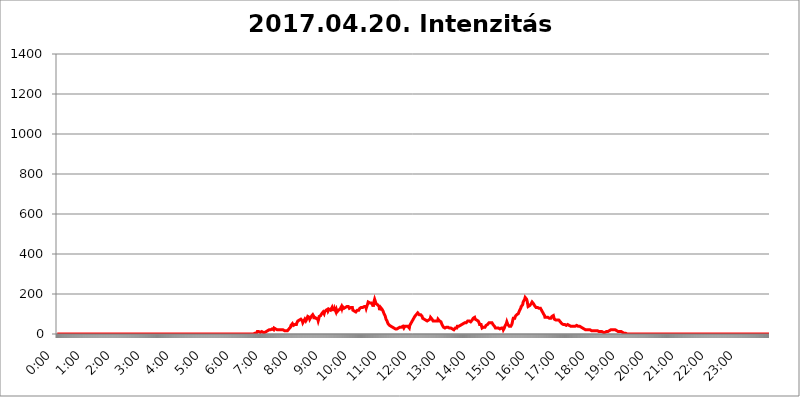
| Category | 2017.04.20. Intenzitás [W/m^2] |
|---|---|
| 0.0 | 0 |
| 0.0006944444444444445 | 0 |
| 0.001388888888888889 | 0 |
| 0.0020833333333333333 | 0 |
| 0.002777777777777778 | 0 |
| 0.003472222222222222 | 0 |
| 0.004166666666666667 | 0 |
| 0.004861111111111111 | 0 |
| 0.005555555555555556 | 0 |
| 0.0062499999999999995 | 0 |
| 0.006944444444444444 | 0 |
| 0.007638888888888889 | 0 |
| 0.008333333333333333 | 0 |
| 0.009027777777777779 | 0 |
| 0.009722222222222222 | 0 |
| 0.010416666666666666 | 0 |
| 0.011111111111111112 | 0 |
| 0.011805555555555555 | 0 |
| 0.012499999999999999 | 0 |
| 0.013194444444444444 | 0 |
| 0.013888888888888888 | 0 |
| 0.014583333333333332 | 0 |
| 0.015277777777777777 | 0 |
| 0.015972222222222224 | 0 |
| 0.016666666666666666 | 0 |
| 0.017361111111111112 | 0 |
| 0.018055555555555557 | 0 |
| 0.01875 | 0 |
| 0.019444444444444445 | 0 |
| 0.02013888888888889 | 0 |
| 0.020833333333333332 | 0 |
| 0.02152777777777778 | 0 |
| 0.022222222222222223 | 0 |
| 0.02291666666666667 | 0 |
| 0.02361111111111111 | 0 |
| 0.024305555555555556 | 0 |
| 0.024999999999999998 | 0 |
| 0.025694444444444447 | 0 |
| 0.02638888888888889 | 0 |
| 0.027083333333333334 | 0 |
| 0.027777777777777776 | 0 |
| 0.02847222222222222 | 0 |
| 0.029166666666666664 | 0 |
| 0.029861111111111113 | 0 |
| 0.030555555555555555 | 0 |
| 0.03125 | 0 |
| 0.03194444444444445 | 0 |
| 0.03263888888888889 | 0 |
| 0.03333333333333333 | 0 |
| 0.034027777777777775 | 0 |
| 0.034722222222222224 | 0 |
| 0.035416666666666666 | 0 |
| 0.036111111111111115 | 0 |
| 0.03680555555555556 | 0 |
| 0.0375 | 0 |
| 0.03819444444444444 | 0 |
| 0.03888888888888889 | 0 |
| 0.03958333333333333 | 0 |
| 0.04027777777777778 | 0 |
| 0.04097222222222222 | 0 |
| 0.041666666666666664 | 0 |
| 0.042361111111111106 | 0 |
| 0.04305555555555556 | 0 |
| 0.043750000000000004 | 0 |
| 0.044444444444444446 | 0 |
| 0.04513888888888889 | 0 |
| 0.04583333333333334 | 0 |
| 0.04652777777777778 | 0 |
| 0.04722222222222222 | 0 |
| 0.04791666666666666 | 0 |
| 0.04861111111111111 | 0 |
| 0.049305555555555554 | 0 |
| 0.049999999999999996 | 0 |
| 0.05069444444444445 | 0 |
| 0.051388888888888894 | 0 |
| 0.052083333333333336 | 0 |
| 0.05277777777777778 | 0 |
| 0.05347222222222222 | 0 |
| 0.05416666666666667 | 0 |
| 0.05486111111111111 | 0 |
| 0.05555555555555555 | 0 |
| 0.05625 | 0 |
| 0.05694444444444444 | 0 |
| 0.057638888888888885 | 0 |
| 0.05833333333333333 | 0 |
| 0.05902777777777778 | 0 |
| 0.059722222222222225 | 0 |
| 0.06041666666666667 | 0 |
| 0.061111111111111116 | 0 |
| 0.06180555555555556 | 0 |
| 0.0625 | 0 |
| 0.06319444444444444 | 0 |
| 0.06388888888888888 | 0 |
| 0.06458333333333334 | 0 |
| 0.06527777777777778 | 0 |
| 0.06597222222222222 | 0 |
| 0.06666666666666667 | 0 |
| 0.06736111111111111 | 0 |
| 0.06805555555555555 | 0 |
| 0.06874999999999999 | 0 |
| 0.06944444444444443 | 0 |
| 0.07013888888888889 | 0 |
| 0.07083333333333333 | 0 |
| 0.07152777777777779 | 0 |
| 0.07222222222222223 | 0 |
| 0.07291666666666667 | 0 |
| 0.07361111111111111 | 0 |
| 0.07430555555555556 | 0 |
| 0.075 | 0 |
| 0.07569444444444444 | 0 |
| 0.0763888888888889 | 0 |
| 0.07708333333333334 | 0 |
| 0.07777777777777778 | 0 |
| 0.07847222222222222 | 0 |
| 0.07916666666666666 | 0 |
| 0.0798611111111111 | 0 |
| 0.08055555555555556 | 0 |
| 0.08125 | 0 |
| 0.08194444444444444 | 0 |
| 0.08263888888888889 | 0 |
| 0.08333333333333333 | 0 |
| 0.08402777777777777 | 0 |
| 0.08472222222222221 | 0 |
| 0.08541666666666665 | 0 |
| 0.08611111111111112 | 0 |
| 0.08680555555555557 | 0 |
| 0.08750000000000001 | 0 |
| 0.08819444444444445 | 0 |
| 0.08888888888888889 | 0 |
| 0.08958333333333333 | 0 |
| 0.09027777777777778 | 0 |
| 0.09097222222222222 | 0 |
| 0.09166666666666667 | 0 |
| 0.09236111111111112 | 0 |
| 0.09305555555555556 | 0 |
| 0.09375 | 0 |
| 0.09444444444444444 | 0 |
| 0.09513888888888888 | 0 |
| 0.09583333333333333 | 0 |
| 0.09652777777777777 | 0 |
| 0.09722222222222222 | 0 |
| 0.09791666666666667 | 0 |
| 0.09861111111111111 | 0 |
| 0.09930555555555555 | 0 |
| 0.09999999999999999 | 0 |
| 0.10069444444444443 | 0 |
| 0.1013888888888889 | 0 |
| 0.10208333333333335 | 0 |
| 0.10277777777777779 | 0 |
| 0.10347222222222223 | 0 |
| 0.10416666666666667 | 0 |
| 0.10486111111111111 | 0 |
| 0.10555555555555556 | 0 |
| 0.10625 | 0 |
| 0.10694444444444444 | 0 |
| 0.1076388888888889 | 0 |
| 0.10833333333333334 | 0 |
| 0.10902777777777778 | 0 |
| 0.10972222222222222 | 0 |
| 0.1111111111111111 | 0 |
| 0.11180555555555556 | 0 |
| 0.11180555555555556 | 0 |
| 0.1125 | 0 |
| 0.11319444444444444 | 0 |
| 0.11388888888888889 | 0 |
| 0.11458333333333333 | 0 |
| 0.11527777777777777 | 0 |
| 0.11597222222222221 | 0 |
| 0.11666666666666665 | 0 |
| 0.1173611111111111 | 0 |
| 0.11805555555555557 | 0 |
| 0.11944444444444445 | 0 |
| 0.12013888888888889 | 0 |
| 0.12083333333333333 | 0 |
| 0.12152777777777778 | 0 |
| 0.12222222222222223 | 0 |
| 0.12291666666666667 | 0 |
| 0.12291666666666667 | 0 |
| 0.12361111111111112 | 0 |
| 0.12430555555555556 | 0 |
| 0.125 | 0 |
| 0.12569444444444444 | 0 |
| 0.12638888888888888 | 0 |
| 0.12708333333333333 | 0 |
| 0.16875 | 0 |
| 0.12847222222222224 | 0 |
| 0.12916666666666668 | 0 |
| 0.12986111111111112 | 0 |
| 0.13055555555555556 | 0 |
| 0.13125 | 0 |
| 0.13194444444444445 | 0 |
| 0.1326388888888889 | 0 |
| 0.13333333333333333 | 0 |
| 0.13402777777777777 | 0 |
| 0.13402777777777777 | 0 |
| 0.13472222222222222 | 0 |
| 0.13541666666666666 | 0 |
| 0.1361111111111111 | 0 |
| 0.13749999999999998 | 0 |
| 0.13819444444444443 | 0 |
| 0.1388888888888889 | 0 |
| 0.13958333333333334 | 0 |
| 0.14027777777777778 | 0 |
| 0.14097222222222222 | 0 |
| 0.14166666666666666 | 0 |
| 0.1423611111111111 | 0 |
| 0.14305555555555557 | 0 |
| 0.14375000000000002 | 0 |
| 0.14444444444444446 | 0 |
| 0.1451388888888889 | 0 |
| 0.1451388888888889 | 0 |
| 0.14652777777777778 | 0 |
| 0.14722222222222223 | 0 |
| 0.14791666666666667 | 0 |
| 0.1486111111111111 | 0 |
| 0.14930555555555555 | 0 |
| 0.15 | 0 |
| 0.15069444444444444 | 0 |
| 0.15138888888888888 | 0 |
| 0.15208333333333332 | 0 |
| 0.15277777777777776 | 0 |
| 0.15347222222222223 | 0 |
| 0.15416666666666667 | 0 |
| 0.15486111111111112 | 0 |
| 0.15555555555555556 | 0 |
| 0.15625 | 0 |
| 0.15694444444444444 | 0 |
| 0.15763888888888888 | 0 |
| 0.15833333333333333 | 0 |
| 0.15902777777777777 | 0 |
| 0.15972222222222224 | 0 |
| 0.16041666666666668 | 0 |
| 0.16111111111111112 | 0 |
| 0.16180555555555556 | 0 |
| 0.1625 | 0 |
| 0.16319444444444445 | 0 |
| 0.1638888888888889 | 0 |
| 0.16458333333333333 | 0 |
| 0.16527777777777777 | 0 |
| 0.16597222222222222 | 0 |
| 0.16666666666666666 | 0 |
| 0.1673611111111111 | 0 |
| 0.16805555555555554 | 0 |
| 0.16874999999999998 | 0 |
| 0.16944444444444443 | 0 |
| 0.17013888888888887 | 0 |
| 0.1708333333333333 | 0 |
| 0.17152777777777775 | 0 |
| 0.17222222222222225 | 0 |
| 0.1729166666666667 | 0 |
| 0.17361111111111113 | 0 |
| 0.17430555555555557 | 0 |
| 0.17500000000000002 | 0 |
| 0.17569444444444446 | 0 |
| 0.1763888888888889 | 0 |
| 0.17708333333333334 | 0 |
| 0.17777777777777778 | 0 |
| 0.17847222222222223 | 0 |
| 0.17916666666666667 | 0 |
| 0.1798611111111111 | 0 |
| 0.18055555555555555 | 0 |
| 0.18125 | 0 |
| 0.18194444444444444 | 0 |
| 0.1826388888888889 | 0 |
| 0.18333333333333335 | 0 |
| 0.1840277777777778 | 0 |
| 0.18472222222222223 | 0 |
| 0.18541666666666667 | 0 |
| 0.18611111111111112 | 0 |
| 0.18680555555555556 | 0 |
| 0.1875 | 0 |
| 0.18819444444444444 | 0 |
| 0.18888888888888888 | 0 |
| 0.18958333333333333 | 0 |
| 0.19027777777777777 | 0 |
| 0.1909722222222222 | 0 |
| 0.19166666666666665 | 0 |
| 0.19236111111111112 | 0 |
| 0.19305555555555554 | 0 |
| 0.19375 | 0 |
| 0.19444444444444445 | 0 |
| 0.1951388888888889 | 0 |
| 0.19583333333333333 | 0 |
| 0.19652777777777777 | 0 |
| 0.19722222222222222 | 0 |
| 0.19791666666666666 | 0 |
| 0.1986111111111111 | 0 |
| 0.19930555555555554 | 0 |
| 0.19999999999999998 | 0 |
| 0.20069444444444443 | 0 |
| 0.20138888888888887 | 0 |
| 0.2020833333333333 | 0 |
| 0.2027777777777778 | 0 |
| 0.2034722222222222 | 0 |
| 0.2041666666666667 | 0 |
| 0.20486111111111113 | 0 |
| 0.20555555555555557 | 0 |
| 0.20625000000000002 | 0 |
| 0.20694444444444446 | 0 |
| 0.2076388888888889 | 0 |
| 0.20833333333333334 | 0 |
| 0.20902777777777778 | 0 |
| 0.20972222222222223 | 0 |
| 0.21041666666666667 | 0 |
| 0.2111111111111111 | 0 |
| 0.21180555555555555 | 0 |
| 0.2125 | 0 |
| 0.21319444444444444 | 0 |
| 0.2138888888888889 | 0 |
| 0.21458333333333335 | 0 |
| 0.2152777777777778 | 0 |
| 0.21597222222222223 | 0 |
| 0.21666666666666667 | 0 |
| 0.21736111111111112 | 0 |
| 0.21805555555555556 | 0 |
| 0.21875 | 0 |
| 0.21944444444444444 | 0 |
| 0.22013888888888888 | 0 |
| 0.22083333333333333 | 0 |
| 0.22152777777777777 | 0 |
| 0.2222222222222222 | 0 |
| 0.22291666666666665 | 0 |
| 0.2236111111111111 | 0 |
| 0.22430555555555556 | 0 |
| 0.225 | 0 |
| 0.22569444444444445 | 0 |
| 0.2263888888888889 | 0 |
| 0.22708333333333333 | 0 |
| 0.22777777777777777 | 0 |
| 0.22847222222222222 | 0 |
| 0.22916666666666666 | 0 |
| 0.2298611111111111 | 0 |
| 0.23055555555555554 | 0 |
| 0.23124999999999998 | 0 |
| 0.23194444444444443 | 0 |
| 0.23263888888888887 | 0 |
| 0.2333333333333333 | 0 |
| 0.2340277777777778 | 0 |
| 0.2347222222222222 | 0 |
| 0.2354166666666667 | 0 |
| 0.23611111111111113 | 0 |
| 0.23680555555555557 | 0 |
| 0.23750000000000002 | 0 |
| 0.23819444444444446 | 0 |
| 0.2388888888888889 | 0 |
| 0.23958333333333334 | 0 |
| 0.24027777777777778 | 0 |
| 0.24097222222222223 | 0 |
| 0.24166666666666667 | 0 |
| 0.2423611111111111 | 0 |
| 0.24305555555555555 | 0 |
| 0.24375 | 0 |
| 0.24444444444444446 | 0 |
| 0.24513888888888888 | 0 |
| 0.24583333333333335 | 0 |
| 0.2465277777777778 | 0 |
| 0.24722222222222223 | 0 |
| 0.24791666666666667 | 0 |
| 0.24861111111111112 | 0 |
| 0.24930555555555556 | 0 |
| 0.25 | 0 |
| 0.25069444444444444 | 0 |
| 0.2513888888888889 | 0 |
| 0.2520833333333333 | 0 |
| 0.25277777777777777 | 0 |
| 0.2534722222222222 | 0 |
| 0.25416666666666665 | 0 |
| 0.2548611111111111 | 0 |
| 0.2555555555555556 | 0 |
| 0.25625000000000003 | 0 |
| 0.2569444444444445 | 0 |
| 0.2576388888888889 | 0 |
| 0.25833333333333336 | 0 |
| 0.2590277777777778 | 0 |
| 0.25972222222222224 | 0 |
| 0.2604166666666667 | 0 |
| 0.2611111111111111 | 0 |
| 0.26180555555555557 | 0 |
| 0.2625 | 0 |
| 0.26319444444444445 | 0 |
| 0.2638888888888889 | 0 |
| 0.26458333333333334 | 0 |
| 0.2652777777777778 | 0 |
| 0.2659722222222222 | 0 |
| 0.26666666666666666 | 0 |
| 0.2673611111111111 | 0 |
| 0.26805555555555555 | 0 |
| 0.26875 | 0 |
| 0.26944444444444443 | 0 |
| 0.2701388888888889 | 0 |
| 0.2708333333333333 | 0 |
| 0.27152777777777776 | 0 |
| 0.2722222222222222 | 0 |
| 0.27291666666666664 | 0 |
| 0.2736111111111111 | 3.525 |
| 0.2743055555555555 | 0 |
| 0.27499999999999997 | 0 |
| 0.27569444444444446 | 0 |
| 0.27638888888888885 | 3.525 |
| 0.27708333333333335 | 3.525 |
| 0.2777777777777778 | 3.525 |
| 0.27847222222222223 | 3.525 |
| 0.2791666666666667 | 3.525 |
| 0.2798611111111111 | 7.887 |
| 0.28055555555555556 | 12.257 |
| 0.28125 | 12.257 |
| 0.28194444444444444 | 12.257 |
| 0.2826388888888889 | 12.257 |
| 0.2833333333333333 | 12.257 |
| 0.28402777777777777 | 12.257 |
| 0.2847222222222222 | 7.887 |
| 0.28541666666666665 | 7.887 |
| 0.28611111111111115 | 12.257 |
| 0.28680555555555554 | 12.257 |
| 0.28750000000000003 | 7.887 |
| 0.2881944444444445 | 7.887 |
| 0.2888888888888889 | 7.887 |
| 0.28958333333333336 | 3.525 |
| 0.2902777777777778 | 7.887 |
| 0.29097222222222224 | 7.887 |
| 0.2916666666666667 | 7.887 |
| 0.2923611111111111 | 7.887 |
| 0.29305555555555557 | 12.257 |
| 0.29375 | 12.257 |
| 0.29444444444444445 | 12.257 |
| 0.2951388888888889 | 16.636 |
| 0.29583333333333334 | 12.257 |
| 0.2965277777777778 | 16.636 |
| 0.2972222222222222 | 21.024 |
| 0.29791666666666666 | 16.636 |
| 0.2986111111111111 | 16.636 |
| 0.29930555555555555 | 21.024 |
| 0.3 | 25.419 |
| 0.30069444444444443 | 25.419 |
| 0.3013888888888889 | 25.419 |
| 0.3020833333333333 | 25.419 |
| 0.30277777777777776 | 21.024 |
| 0.3034722222222222 | 21.024 |
| 0.30416666666666664 | 29.823 |
| 0.3048611111111111 | 25.419 |
| 0.3055555555555555 | 25.419 |
| 0.30624999999999997 | 25.419 |
| 0.3069444444444444 | 25.419 |
| 0.3076388888888889 | 25.419 |
| 0.30833333333333335 | 21.024 |
| 0.3090277777777778 | 21.024 |
| 0.30972222222222223 | 21.024 |
| 0.3104166666666667 | 21.024 |
| 0.3111111111111111 | 21.024 |
| 0.31180555555555556 | 21.024 |
| 0.3125 | 21.024 |
| 0.31319444444444444 | 21.024 |
| 0.3138888888888889 | 21.024 |
| 0.3145833333333333 | 21.024 |
| 0.31527777777777777 | 21.024 |
| 0.3159722222222222 | 25.419 |
| 0.31666666666666665 | 21.024 |
| 0.31736111111111115 | 16.636 |
| 0.31805555555555554 | 16.636 |
| 0.31875000000000003 | 16.636 |
| 0.3194444444444445 | 16.636 |
| 0.3201388888888889 | 16.636 |
| 0.32083333333333336 | 16.636 |
| 0.3215277777777778 | 16.636 |
| 0.32222222222222224 | 16.636 |
| 0.3229166666666667 | 16.636 |
| 0.3236111111111111 | 21.024 |
| 0.32430555555555557 | 21.024 |
| 0.325 | 25.419 |
| 0.32569444444444445 | 29.823 |
| 0.3263888888888889 | 29.823 |
| 0.32708333333333334 | 34.234 |
| 0.3277777777777778 | 43.079 |
| 0.3284722222222222 | 47.511 |
| 0.32916666666666666 | 47.511 |
| 0.3298611111111111 | 51.951 |
| 0.33055555555555555 | 51.951 |
| 0.33125 | 43.079 |
| 0.33194444444444443 | 43.079 |
| 0.3326388888888889 | 47.511 |
| 0.3333333333333333 | 47.511 |
| 0.3340277777777778 | 47.511 |
| 0.3347222222222222 | 47.511 |
| 0.3354166666666667 | 47.511 |
| 0.3361111111111111 | 56.398 |
| 0.3368055555555556 | 51.951 |
| 0.33749999999999997 | 65.31 |
| 0.33819444444444446 | 65.31 |
| 0.33888888888888885 | 65.31 |
| 0.33958333333333335 | 69.775 |
| 0.34027777777777773 | 74.246 |
| 0.34097222222222223 | 74.246 |
| 0.3416666666666666 | 74.246 |
| 0.3423611111111111 | 69.775 |
| 0.3430555555555555 | 69.775 |
| 0.34375 | 65.31 |
| 0.3444444444444445 | 56.398 |
| 0.3451388888888889 | 60.85 |
| 0.3458333333333334 | 65.31 |
| 0.34652777777777777 | 65.31 |
| 0.34722222222222227 | 74.246 |
| 0.34791666666666665 | 74.246 |
| 0.34861111111111115 | 65.31 |
| 0.34930555555555554 | 69.775 |
| 0.35000000000000003 | 74.246 |
| 0.3506944444444444 | 74.246 |
| 0.3513888888888889 | 87.692 |
| 0.3520833333333333 | 87.692 |
| 0.3527777777777778 | 87.692 |
| 0.3534722222222222 | 83.205 |
| 0.3541666666666667 | 74.246 |
| 0.3548611111111111 | 74.246 |
| 0.35555555555555557 | 78.722 |
| 0.35625 | 87.692 |
| 0.35694444444444445 | 92.184 |
| 0.3576388888888889 | 92.184 |
| 0.35833333333333334 | 96.682 |
| 0.3590277777777778 | 92.184 |
| 0.3597222222222222 | 87.692 |
| 0.36041666666666666 | 74.246 |
| 0.3611111111111111 | 83.205 |
| 0.36180555555555555 | 83.205 |
| 0.3625 | 78.722 |
| 0.36319444444444443 | 78.722 |
| 0.3638888888888889 | 78.722 |
| 0.3645833333333333 | 83.205 |
| 0.3652777777777778 | 74.246 |
| 0.3659722222222222 | 65.31 |
| 0.3666666666666667 | 74.246 |
| 0.3673611111111111 | 87.692 |
| 0.3680555555555556 | 92.184 |
| 0.36874999999999997 | 92.184 |
| 0.36944444444444446 | 92.184 |
| 0.37013888888888885 | 96.682 |
| 0.37083333333333335 | 101.184 |
| 0.37152777777777773 | 105.69 |
| 0.37222222222222223 | 101.184 |
| 0.3729166666666666 | 110.201 |
| 0.3736111111111111 | 110.201 |
| 0.3743055555555555 | 101.184 |
| 0.375 | 110.201 |
| 0.3756944444444445 | 110.201 |
| 0.3763888888888889 | 114.716 |
| 0.3770833333333334 | 119.235 |
| 0.37777777777777777 | 123.758 |
| 0.37847222222222227 | 114.716 |
| 0.37916666666666665 | 123.758 |
| 0.37986111111111115 | 114.716 |
| 0.38055555555555554 | 110.201 |
| 0.38125000000000003 | 123.758 |
| 0.3819444444444444 | 119.235 |
| 0.3826388888888889 | 119.235 |
| 0.3833333333333333 | 119.235 |
| 0.3840277777777778 | 123.758 |
| 0.3847222222222222 | 119.235 |
| 0.3854166666666667 | 132.814 |
| 0.3861111111111111 | 123.758 |
| 0.38680555555555557 | 114.716 |
| 0.3875 | 132.814 |
| 0.38819444444444445 | 119.235 |
| 0.3888888888888889 | 128.284 |
| 0.38958333333333334 | 128.284 |
| 0.3902777777777778 | 123.758 |
| 0.3909722222222222 | 110.201 |
| 0.39166666666666666 | 119.235 |
| 0.3923611111111111 | 110.201 |
| 0.39305555555555555 | 105.69 |
| 0.39375 | 114.716 |
| 0.39444444444444443 | 119.235 |
| 0.3951388888888889 | 119.235 |
| 0.3958333333333333 | 119.235 |
| 0.3965277777777778 | 123.758 |
| 0.3972222222222222 | 128.284 |
| 0.3979166666666667 | 128.284 |
| 0.3986111111111111 | 137.347 |
| 0.3993055555555556 | 128.284 |
| 0.39999999999999997 | 137.347 |
| 0.40069444444444446 | 137.347 |
| 0.40138888888888885 | 132.814 |
| 0.40208333333333335 | 128.284 |
| 0.40277777777777773 | 128.284 |
| 0.40347222222222223 | 128.284 |
| 0.4041666666666666 | 132.814 |
| 0.4048611111111111 | 137.347 |
| 0.4055555555555555 | 137.347 |
| 0.40625 | 137.347 |
| 0.4069444444444445 | 132.814 |
| 0.4076388888888889 | 137.347 |
| 0.4083333333333334 | 137.347 |
| 0.40902777777777777 | 132.814 |
| 0.40972222222222227 | 128.284 |
| 0.41041666666666665 | 128.284 |
| 0.41111111111111115 | 128.284 |
| 0.41180555555555554 | 132.814 |
| 0.41250000000000003 | 128.284 |
| 0.4131944444444444 | 132.814 |
| 0.4138888888888889 | 132.814 |
| 0.4145833333333333 | 119.235 |
| 0.4152777777777778 | 123.758 |
| 0.4159722222222222 | 123.758 |
| 0.4166666666666667 | 114.716 |
| 0.4173611111111111 | 114.716 |
| 0.41805555555555557 | 110.201 |
| 0.41875 | 110.201 |
| 0.41944444444444445 | 105.69 |
| 0.4201388888888889 | 114.716 |
| 0.42083333333333334 | 119.235 |
| 0.4215277777777778 | 119.235 |
| 0.4222222222222222 | 114.716 |
| 0.42291666666666666 | 119.235 |
| 0.4236111111111111 | 123.758 |
| 0.42430555555555555 | 128.284 |
| 0.425 | 128.284 |
| 0.42569444444444443 | 132.814 |
| 0.4263888888888889 | 132.814 |
| 0.4270833333333333 | 128.284 |
| 0.4277777777777778 | 137.347 |
| 0.4284722222222222 | 132.814 |
| 0.4291666666666667 | 137.347 |
| 0.4298611111111111 | 137.347 |
| 0.4305555555555556 | 137.347 |
| 0.43124999999999997 | 141.884 |
| 0.43194444444444446 | 137.347 |
| 0.43263888888888885 | 137.347 |
| 0.43333333333333335 | 128.284 |
| 0.43402777777777773 | 132.814 |
| 0.43472222222222223 | 132.814 |
| 0.4354166666666666 | 150.964 |
| 0.4361111111111111 | 160.056 |
| 0.4368055555555555 | 155.509 |
| 0.4375 | 155.509 |
| 0.4381944444444445 | 155.509 |
| 0.4388888888888889 | 155.509 |
| 0.4395833333333334 | 155.509 |
| 0.44027777777777777 | 155.509 |
| 0.44097222222222227 | 155.509 |
| 0.44166666666666665 | 155.509 |
| 0.44236111111111115 | 146.423 |
| 0.44305555555555554 | 137.347 |
| 0.44375000000000003 | 155.509 |
| 0.4444444444444444 | 164.605 |
| 0.4451388888888889 | 173.709 |
| 0.4458333333333333 | 169.156 |
| 0.4465277777777778 | 169.156 |
| 0.4472222222222222 | 150.964 |
| 0.4479166666666667 | 150.964 |
| 0.4486111111111111 | 150.964 |
| 0.44930555555555557 | 146.423 |
| 0.45 | 146.423 |
| 0.45069444444444445 | 146.423 |
| 0.4513888888888889 | 137.347 |
| 0.45208333333333334 | 119.235 |
| 0.4527777777777778 | 119.235 |
| 0.4534722222222222 | 132.814 |
| 0.45416666666666666 | 128.284 |
| 0.4548611111111111 | 128.284 |
| 0.45555555555555555 | 123.758 |
| 0.45625 | 119.235 |
| 0.45694444444444443 | 114.716 |
| 0.4576388888888889 | 110.201 |
| 0.4583333333333333 | 101.184 |
| 0.4590277777777778 | 96.682 |
| 0.4597222222222222 | 92.184 |
| 0.4604166666666667 | 83.205 |
| 0.4611111111111111 | 74.246 |
| 0.4618055555555556 | 69.775 |
| 0.46249999999999997 | 65.31 |
| 0.46319444444444446 | 60.85 |
| 0.46388888888888885 | 51.951 |
| 0.46458333333333335 | 47.511 |
| 0.46527777777777773 | 47.511 |
| 0.46597222222222223 | 43.079 |
| 0.4666666666666666 | 43.079 |
| 0.4673611111111111 | 38.653 |
| 0.4680555555555555 | 38.653 |
| 0.46875 | 38.653 |
| 0.4694444444444445 | 34.234 |
| 0.4701388888888889 | 34.234 |
| 0.4708333333333334 | 29.823 |
| 0.47152777777777777 | 29.823 |
| 0.47222222222222227 | 29.823 |
| 0.47291666666666665 | 29.823 |
| 0.47361111111111115 | 29.823 |
| 0.47430555555555554 | 25.419 |
| 0.47500000000000003 | 25.419 |
| 0.4756944444444444 | 25.419 |
| 0.4763888888888889 | 25.419 |
| 0.4770833333333333 | 25.419 |
| 0.4777777777777778 | 29.823 |
| 0.4784722222222222 | 29.823 |
| 0.4791666666666667 | 29.823 |
| 0.4798611111111111 | 29.823 |
| 0.48055555555555557 | 34.234 |
| 0.48125 | 34.234 |
| 0.48194444444444445 | 34.234 |
| 0.4826388888888889 | 34.234 |
| 0.48333333333333334 | 38.653 |
| 0.4840277777777778 | 38.653 |
| 0.4847222222222222 | 38.653 |
| 0.48541666666666666 | 34.234 |
| 0.4861111111111111 | 29.823 |
| 0.48680555555555555 | 34.234 |
| 0.4875 | 38.653 |
| 0.48819444444444443 | 38.653 |
| 0.4888888888888889 | 38.653 |
| 0.4895833333333333 | 38.653 |
| 0.4902777777777778 | 38.653 |
| 0.4909722222222222 | 38.653 |
| 0.4916666666666667 | 38.653 |
| 0.4923611111111111 | 34.234 |
| 0.4930555555555556 | 34.234 |
| 0.49374999999999997 | 29.823 |
| 0.49444444444444446 | 43.079 |
| 0.49513888888888885 | 43.079 |
| 0.49583333333333335 | 47.511 |
| 0.49652777777777773 | 56.398 |
| 0.49722222222222223 | 60.85 |
| 0.4979166666666666 | 65.31 |
| 0.4986111111111111 | 69.775 |
| 0.4993055555555555 | 74.246 |
| 0.5 | 74.246 |
| 0.5006944444444444 | 78.722 |
| 0.5013888888888889 | 87.692 |
| 0.5020833333333333 | 92.184 |
| 0.5027777777777778 | 92.184 |
| 0.5034722222222222 | 96.682 |
| 0.5041666666666667 | 101.184 |
| 0.5048611111111111 | 101.184 |
| 0.5055555555555555 | 105.69 |
| 0.50625 | 101.184 |
| 0.5069444444444444 | 101.184 |
| 0.5076388888888889 | 96.682 |
| 0.5083333333333333 | 92.184 |
| 0.5090277777777777 | 96.682 |
| 0.5097222222222222 | 96.682 |
| 0.5104166666666666 | 92.184 |
| 0.5111111111111112 | 92.184 |
| 0.5118055555555555 | 87.692 |
| 0.5125000000000001 | 78.722 |
| 0.5131944444444444 | 78.722 |
| 0.513888888888889 | 78.722 |
| 0.5145833333333333 | 74.246 |
| 0.5152777777777778 | 69.775 |
| 0.5159722222222222 | 69.775 |
| 0.5166666666666667 | 69.775 |
| 0.517361111111111 | 74.246 |
| 0.5180555555555556 | 69.775 |
| 0.5187499999999999 | 65.31 |
| 0.5194444444444445 | 65.31 |
| 0.5201388888888888 | 65.31 |
| 0.5208333333333334 | 69.775 |
| 0.5215277777777778 | 74.246 |
| 0.5222222222222223 | 74.246 |
| 0.5229166666666667 | 74.246 |
| 0.5236111111111111 | 83.205 |
| 0.5243055555555556 | 83.205 |
| 0.525 | 78.722 |
| 0.5256944444444445 | 74.246 |
| 0.5263888888888889 | 74.246 |
| 0.5270833333333333 | 65.31 |
| 0.5277777777777778 | 65.31 |
| 0.5284722222222222 | 69.775 |
| 0.5291666666666667 | 65.31 |
| 0.5298611111111111 | 65.31 |
| 0.5305555555555556 | 65.31 |
| 0.53125 | 65.31 |
| 0.5319444444444444 | 65.31 |
| 0.5326388888888889 | 60.85 |
| 0.5333333333333333 | 65.31 |
| 0.5340277777777778 | 74.246 |
| 0.5347222222222222 | 74.246 |
| 0.5354166666666667 | 69.775 |
| 0.5361111111111111 | 65.31 |
| 0.5368055555555555 | 60.85 |
| 0.5375 | 60.85 |
| 0.5381944444444444 | 60.85 |
| 0.5388888888888889 | 56.398 |
| 0.5395833333333333 | 47.511 |
| 0.5402777777777777 | 43.079 |
| 0.5409722222222222 | 43.079 |
| 0.5416666666666666 | 34.234 |
| 0.5423611111111112 | 29.823 |
| 0.5430555555555555 | 29.823 |
| 0.5437500000000001 | 29.823 |
| 0.5444444444444444 | 29.823 |
| 0.545138888888889 | 34.234 |
| 0.5458333333333333 | 34.234 |
| 0.5465277777777778 | 34.234 |
| 0.5472222222222222 | 34.234 |
| 0.5479166666666667 | 34.234 |
| 0.548611111111111 | 34.234 |
| 0.5493055555555556 | 29.823 |
| 0.5499999999999999 | 29.823 |
| 0.5506944444444445 | 29.823 |
| 0.5513888888888888 | 29.823 |
| 0.5520833333333334 | 29.823 |
| 0.5527777777777778 | 29.823 |
| 0.5534722222222223 | 29.823 |
| 0.5541666666666667 | 25.419 |
| 0.5548611111111111 | 25.419 |
| 0.5555555555555556 | 21.024 |
| 0.55625 | 21.024 |
| 0.5569444444444445 | 25.419 |
| 0.5576388888888889 | 25.419 |
| 0.5583333333333333 | 29.823 |
| 0.5590277777777778 | 29.823 |
| 0.5597222222222222 | 34.234 |
| 0.5604166666666667 | 29.823 |
| 0.5611111111111111 | 38.653 |
| 0.5618055555555556 | 38.653 |
| 0.5625 | 38.653 |
| 0.5631944444444444 | 38.653 |
| 0.5638888888888889 | 38.653 |
| 0.5645833333333333 | 38.653 |
| 0.5652777777777778 | 43.079 |
| 0.5659722222222222 | 47.511 |
| 0.5666666666666667 | 47.511 |
| 0.5673611111111111 | 47.511 |
| 0.5680555555555555 | 47.511 |
| 0.56875 | 51.951 |
| 0.5694444444444444 | 51.951 |
| 0.5701388888888889 | 47.511 |
| 0.5708333333333333 | 56.398 |
| 0.5715277777777777 | 56.398 |
| 0.5722222222222222 | 56.398 |
| 0.5729166666666666 | 56.398 |
| 0.5736111111111112 | 56.398 |
| 0.5743055555555555 | 60.85 |
| 0.5750000000000001 | 60.85 |
| 0.5756944444444444 | 65.31 |
| 0.576388888888889 | 60.85 |
| 0.5770833333333333 | 60.85 |
| 0.5777777777777778 | 65.31 |
| 0.5784722222222222 | 65.31 |
| 0.5791666666666667 | 65.31 |
| 0.579861111111111 | 60.85 |
| 0.5805555555555556 | 65.31 |
| 0.5812499999999999 | 65.31 |
| 0.5819444444444445 | 69.775 |
| 0.5826388888888888 | 74.246 |
| 0.5833333333333334 | 78.722 |
| 0.5840277777777778 | 74.246 |
| 0.5847222222222223 | 74.246 |
| 0.5854166666666667 | 83.205 |
| 0.5861111111111111 | 74.246 |
| 0.5868055555555556 | 69.775 |
| 0.5875 | 74.246 |
| 0.5881944444444445 | 69.775 |
| 0.5888888888888889 | 69.775 |
| 0.5895833333333333 | 69.775 |
| 0.5902777777777778 | 65.31 |
| 0.5909722222222222 | 60.85 |
| 0.5916666666666667 | 56.398 |
| 0.5923611111111111 | 47.511 |
| 0.5930555555555556 | 47.511 |
| 0.59375 | 47.511 |
| 0.5944444444444444 | 47.511 |
| 0.5951388888888889 | 38.653 |
| 0.5958333333333333 | 29.823 |
| 0.5965277777777778 | 29.823 |
| 0.5972222222222222 | 29.823 |
| 0.5979166666666667 | 34.234 |
| 0.5986111111111111 | 34.234 |
| 0.5993055555555555 | 34.234 |
| 0.6 | 34.234 |
| 0.6006944444444444 | 34.234 |
| 0.6013888888888889 | 43.079 |
| 0.6020833333333333 | 43.079 |
| 0.6027777777777777 | 43.079 |
| 0.6034722222222222 | 47.511 |
| 0.6041666666666666 | 51.951 |
| 0.6048611111111112 | 51.951 |
| 0.6055555555555555 | 56.398 |
| 0.6062500000000001 | 60.85 |
| 0.6069444444444444 | 60.85 |
| 0.607638888888889 | 56.398 |
| 0.6083333333333333 | 51.951 |
| 0.6090277777777778 | 51.951 |
| 0.6097222222222222 | 56.398 |
| 0.6104166666666667 | 56.398 |
| 0.611111111111111 | 47.511 |
| 0.6118055555555556 | 43.079 |
| 0.6124999999999999 | 43.079 |
| 0.6131944444444445 | 38.653 |
| 0.6138888888888888 | 34.234 |
| 0.6145833333333334 | 29.823 |
| 0.6152777777777778 | 29.823 |
| 0.6159722222222223 | 29.823 |
| 0.6166666666666667 | 29.823 |
| 0.6173611111111111 | 25.419 |
| 0.6180555555555556 | 25.419 |
| 0.61875 | 29.823 |
| 0.6194444444444445 | 25.419 |
| 0.6201388888888889 | 29.823 |
| 0.6208333333333333 | 25.419 |
| 0.6215277777777778 | 21.024 |
| 0.6222222222222222 | 25.419 |
| 0.6229166666666667 | 29.823 |
| 0.6236111111111111 | 29.823 |
| 0.6243055555555556 | 29.823 |
| 0.625 | 29.823 |
| 0.6256944444444444 | 21.024 |
| 0.6263888888888889 | 25.419 |
| 0.6270833333333333 | 29.823 |
| 0.6277777777777778 | 38.653 |
| 0.6284722222222222 | 34.234 |
| 0.6291666666666667 | 38.653 |
| 0.6298611111111111 | 51.951 |
| 0.6305555555555555 | 60.85 |
| 0.63125 | 56.398 |
| 0.6319444444444444 | 47.511 |
| 0.6326388888888889 | 47.511 |
| 0.6333333333333333 | 43.079 |
| 0.6340277777777777 | 38.653 |
| 0.6347222222222222 | 38.653 |
| 0.6354166666666666 | 43.079 |
| 0.6361111111111112 | 38.653 |
| 0.6368055555555555 | 43.079 |
| 0.6375000000000001 | 47.511 |
| 0.6381944444444444 | 56.398 |
| 0.638888888888889 | 69.775 |
| 0.6395833333333333 | 78.722 |
| 0.6402777777777778 | 78.722 |
| 0.6409722222222222 | 78.722 |
| 0.6416666666666667 | 78.722 |
| 0.642361111111111 | 87.692 |
| 0.6430555555555556 | 87.692 |
| 0.6437499999999999 | 92.184 |
| 0.6444444444444445 | 96.682 |
| 0.6451388888888888 | 101.184 |
| 0.6458333333333334 | 101.184 |
| 0.6465277777777778 | 101.184 |
| 0.6472222222222223 | 101.184 |
| 0.6479166666666667 | 105.69 |
| 0.6486111111111111 | 119.235 |
| 0.6493055555555556 | 123.758 |
| 0.65 | 128.284 |
| 0.6506944444444445 | 137.347 |
| 0.6513888888888889 | 137.347 |
| 0.6520833333333333 | 141.884 |
| 0.6527777777777778 | 146.423 |
| 0.6534722222222222 | 160.056 |
| 0.6541666666666667 | 160.056 |
| 0.6548611111111111 | 160.056 |
| 0.6555555555555556 | 173.709 |
| 0.65625 | 182.82 |
| 0.6569444444444444 | 178.264 |
| 0.6576388888888889 | 178.264 |
| 0.6583333333333333 | 173.709 |
| 0.6590277777777778 | 164.605 |
| 0.6597222222222222 | 150.964 |
| 0.6604166666666667 | 137.347 |
| 0.6611111111111111 | 137.347 |
| 0.6618055555555555 | 137.347 |
| 0.6625 | 141.884 |
| 0.6631944444444444 | 141.884 |
| 0.6638888888888889 | 146.423 |
| 0.6645833333333333 | 150.964 |
| 0.6652777777777777 | 155.509 |
| 0.6659722222222222 | 160.056 |
| 0.6666666666666666 | 155.509 |
| 0.6673611111111111 | 155.509 |
| 0.6680555555555556 | 150.964 |
| 0.6687500000000001 | 146.423 |
| 0.6694444444444444 | 141.884 |
| 0.6701388888888888 | 137.347 |
| 0.6708333333333334 | 137.347 |
| 0.6715277777777778 | 132.814 |
| 0.6722222222222222 | 128.284 |
| 0.6729166666666666 | 128.284 |
| 0.6736111111111112 | 132.814 |
| 0.6743055555555556 | 128.284 |
| 0.6749999999999999 | 132.814 |
| 0.6756944444444444 | 128.284 |
| 0.6763888888888889 | 128.284 |
| 0.6770833333333334 | 132.814 |
| 0.6777777777777777 | 128.284 |
| 0.6784722222222223 | 123.758 |
| 0.6791666666666667 | 123.758 |
| 0.6798611111111111 | 114.716 |
| 0.6805555555555555 | 110.201 |
| 0.68125 | 110.201 |
| 0.6819444444444445 | 101.184 |
| 0.6826388888888889 | 96.682 |
| 0.6833333333333332 | 92.184 |
| 0.6840277777777778 | 83.205 |
| 0.6847222222222222 | 83.205 |
| 0.6854166666666667 | 87.692 |
| 0.686111111111111 | 83.205 |
| 0.6868055555555556 | 83.205 |
| 0.6875 | 87.692 |
| 0.6881944444444444 | 83.205 |
| 0.688888888888889 | 83.205 |
| 0.6895833333333333 | 83.205 |
| 0.6902777777777778 | 78.722 |
| 0.6909722222222222 | 78.722 |
| 0.6916666666666668 | 74.246 |
| 0.6923611111111111 | 78.722 |
| 0.6930555555555555 | 83.205 |
| 0.69375 | 87.692 |
| 0.6944444444444445 | 92.184 |
| 0.6951388888888889 | 92.184 |
| 0.6958333333333333 | 92.184 |
| 0.6965277777777777 | 83.205 |
| 0.6972222222222223 | 74.246 |
| 0.6979166666666666 | 69.775 |
| 0.6986111111111111 | 69.775 |
| 0.6993055555555556 | 69.775 |
| 0.7000000000000001 | 65.31 |
| 0.7006944444444444 | 65.31 |
| 0.7013888888888888 | 69.775 |
| 0.7020833333333334 | 69.775 |
| 0.7027777777777778 | 69.775 |
| 0.7034722222222222 | 69.775 |
| 0.7041666666666666 | 65.31 |
| 0.7048611111111112 | 65.31 |
| 0.7055555555555556 | 60.85 |
| 0.7062499999999999 | 60.85 |
| 0.7069444444444444 | 56.398 |
| 0.7076388888888889 | 51.951 |
| 0.7083333333333334 | 47.511 |
| 0.7090277777777777 | 47.511 |
| 0.7097222222222223 | 47.511 |
| 0.7104166666666667 | 43.079 |
| 0.7111111111111111 | 47.511 |
| 0.7118055555555555 | 47.511 |
| 0.7125 | 43.079 |
| 0.7131944444444445 | 43.079 |
| 0.7138888888888889 | 43.079 |
| 0.7145833333333332 | 43.079 |
| 0.7152777777777778 | 47.511 |
| 0.7159722222222222 | 47.511 |
| 0.7166666666666667 | 51.951 |
| 0.717361111111111 | 47.511 |
| 0.7180555555555556 | 43.079 |
| 0.71875 | 38.653 |
| 0.7194444444444444 | 43.079 |
| 0.720138888888889 | 38.653 |
| 0.7208333333333333 | 38.653 |
| 0.7215277777777778 | 38.653 |
| 0.7222222222222222 | 38.653 |
| 0.7229166666666668 | 38.653 |
| 0.7236111111111111 | 38.653 |
| 0.7243055555555555 | 38.653 |
| 0.725 | 38.653 |
| 0.7256944444444445 | 38.653 |
| 0.7263888888888889 | 38.653 |
| 0.7270833333333333 | 43.079 |
| 0.7277777777777777 | 43.079 |
| 0.7284722222222223 | 43.079 |
| 0.7291666666666666 | 38.653 |
| 0.7298611111111111 | 38.653 |
| 0.7305555555555556 | 38.653 |
| 0.7312500000000001 | 38.653 |
| 0.7319444444444444 | 38.653 |
| 0.7326388888888888 | 38.653 |
| 0.7333333333333334 | 34.234 |
| 0.7340277777777778 | 34.234 |
| 0.7347222222222222 | 34.234 |
| 0.7354166666666666 | 34.234 |
| 0.7361111111111112 | 29.823 |
| 0.7368055555555556 | 29.823 |
| 0.7374999999999999 | 29.823 |
| 0.7381944444444444 | 25.419 |
| 0.7388888888888889 | 25.419 |
| 0.7395833333333334 | 25.419 |
| 0.7402777777777777 | 21.024 |
| 0.7409722222222223 | 21.024 |
| 0.7416666666666667 | 21.024 |
| 0.7423611111111111 | 21.024 |
| 0.7430555555555555 | 21.024 |
| 0.74375 | 21.024 |
| 0.7444444444444445 | 21.024 |
| 0.7451388888888889 | 21.024 |
| 0.7458333333333332 | 21.024 |
| 0.7465277777777778 | 21.024 |
| 0.7472222222222222 | 21.024 |
| 0.7479166666666667 | 21.024 |
| 0.748611111111111 | 16.636 |
| 0.7493055555555556 | 16.636 |
| 0.75 | 16.636 |
| 0.7506944444444444 | 16.636 |
| 0.751388888888889 | 16.636 |
| 0.7520833333333333 | 16.636 |
| 0.7527777777777778 | 16.636 |
| 0.7534722222222222 | 16.636 |
| 0.7541666666666668 | 16.636 |
| 0.7548611111111111 | 16.636 |
| 0.7555555555555555 | 16.636 |
| 0.75625 | 16.636 |
| 0.7569444444444445 | 16.636 |
| 0.7576388888888889 | 16.636 |
| 0.7583333333333333 | 16.636 |
| 0.7590277777777777 | 16.636 |
| 0.7597222222222223 | 12.257 |
| 0.7604166666666666 | 12.257 |
| 0.7611111111111111 | 12.257 |
| 0.7618055555555556 | 12.257 |
| 0.7625000000000001 | 12.257 |
| 0.7631944444444444 | 12.257 |
| 0.7638888888888888 | 12.257 |
| 0.7645833333333334 | 12.257 |
| 0.7652777777777778 | 12.257 |
| 0.7659722222222222 | 7.887 |
| 0.7666666666666666 | 7.887 |
| 0.7673611111111112 | 7.887 |
| 0.7680555555555556 | 7.887 |
| 0.7687499999999999 | 12.257 |
| 0.7694444444444444 | 12.257 |
| 0.7701388888888889 | 12.257 |
| 0.7708333333333334 | 12.257 |
| 0.7715277777777777 | 12.257 |
| 0.7722222222222223 | 12.257 |
| 0.7729166666666667 | 16.636 |
| 0.7736111111111111 | 16.636 |
| 0.7743055555555555 | 16.636 |
| 0.775 | 16.636 |
| 0.7756944444444445 | 21.024 |
| 0.7763888888888889 | 21.024 |
| 0.7770833333333332 | 21.024 |
| 0.7777777777777778 | 21.024 |
| 0.7784722222222222 | 21.024 |
| 0.7791666666666667 | 21.024 |
| 0.779861111111111 | 21.024 |
| 0.7805555555555556 | 21.024 |
| 0.78125 | 21.024 |
| 0.7819444444444444 | 21.024 |
| 0.782638888888889 | 21.024 |
| 0.7833333333333333 | 21.024 |
| 0.7840277777777778 | 16.636 |
| 0.7847222222222222 | 16.636 |
| 0.7854166666666668 | 16.636 |
| 0.7861111111111111 | 16.636 |
| 0.7868055555555555 | 12.257 |
| 0.7875 | 12.257 |
| 0.7881944444444445 | 12.257 |
| 0.7888888888888889 | 12.257 |
| 0.7895833333333333 | 12.257 |
| 0.7902777777777777 | 12.257 |
| 0.7909722222222223 | 12.257 |
| 0.7916666666666666 | 7.887 |
| 0.7923611111111111 | 7.887 |
| 0.7930555555555556 | 7.887 |
| 0.7937500000000001 | 7.887 |
| 0.7944444444444444 | 3.525 |
| 0.7951388888888888 | 3.525 |
| 0.7958333333333334 | 3.525 |
| 0.7965277777777778 | 3.525 |
| 0.7972222222222222 | 3.525 |
| 0.7979166666666666 | 0 |
| 0.7986111111111112 | 0 |
| 0.7993055555555556 | 0 |
| 0.7999999999999999 | 0 |
| 0.8006944444444444 | 0 |
| 0.8013888888888889 | 0 |
| 0.8020833333333334 | 0 |
| 0.8027777777777777 | 0 |
| 0.8034722222222223 | 0 |
| 0.8041666666666667 | 0 |
| 0.8048611111111111 | 0 |
| 0.8055555555555555 | 0 |
| 0.80625 | 0 |
| 0.8069444444444445 | 0 |
| 0.8076388888888889 | 0 |
| 0.8083333333333332 | 0 |
| 0.8090277777777778 | 0 |
| 0.8097222222222222 | 0 |
| 0.8104166666666667 | 0 |
| 0.811111111111111 | 0 |
| 0.8118055555555556 | 0 |
| 0.8125 | 0 |
| 0.8131944444444444 | 0 |
| 0.813888888888889 | 0 |
| 0.8145833333333333 | 0 |
| 0.8152777777777778 | 0 |
| 0.8159722222222222 | 0 |
| 0.8166666666666668 | 0 |
| 0.8173611111111111 | 0 |
| 0.8180555555555555 | 0 |
| 0.81875 | 0 |
| 0.8194444444444445 | 0 |
| 0.8201388888888889 | 0 |
| 0.8208333333333333 | 0 |
| 0.8215277777777777 | 0 |
| 0.8222222222222223 | 0 |
| 0.8229166666666666 | 0 |
| 0.8236111111111111 | 0 |
| 0.8243055555555556 | 0 |
| 0.8250000000000001 | 0 |
| 0.8256944444444444 | 0 |
| 0.8263888888888888 | 0 |
| 0.8270833333333334 | 0 |
| 0.8277777777777778 | 0 |
| 0.8284722222222222 | 0 |
| 0.8291666666666666 | 0 |
| 0.8298611111111112 | 0 |
| 0.8305555555555556 | 0 |
| 0.8312499999999999 | 0 |
| 0.8319444444444444 | 0 |
| 0.8326388888888889 | 0 |
| 0.8333333333333334 | 0 |
| 0.8340277777777777 | 0 |
| 0.8347222222222223 | 0 |
| 0.8354166666666667 | 0 |
| 0.8361111111111111 | 0 |
| 0.8368055555555555 | 0 |
| 0.8375 | 0 |
| 0.8381944444444445 | 0 |
| 0.8388888888888889 | 0 |
| 0.8395833333333332 | 0 |
| 0.8402777777777778 | 0 |
| 0.8409722222222222 | 0 |
| 0.8416666666666667 | 0 |
| 0.842361111111111 | 0 |
| 0.8430555555555556 | 0 |
| 0.84375 | 0 |
| 0.8444444444444444 | 0 |
| 0.845138888888889 | 0 |
| 0.8458333333333333 | 0 |
| 0.8465277777777778 | 0 |
| 0.8472222222222222 | 0 |
| 0.8479166666666668 | 0 |
| 0.8486111111111111 | 0 |
| 0.8493055555555555 | 0 |
| 0.85 | 0 |
| 0.8506944444444445 | 0 |
| 0.8513888888888889 | 0 |
| 0.8520833333333333 | 0 |
| 0.8527777777777777 | 0 |
| 0.8534722222222223 | 0 |
| 0.8541666666666666 | 0 |
| 0.8548611111111111 | 0 |
| 0.8555555555555556 | 0 |
| 0.8562500000000001 | 0 |
| 0.8569444444444444 | 0 |
| 0.8576388888888888 | 0 |
| 0.8583333333333334 | 0 |
| 0.8590277777777778 | 0 |
| 0.8597222222222222 | 0 |
| 0.8604166666666666 | 0 |
| 0.8611111111111112 | 0 |
| 0.8618055555555556 | 0 |
| 0.8624999999999999 | 0 |
| 0.8631944444444444 | 0 |
| 0.8638888888888889 | 0 |
| 0.8645833333333334 | 0 |
| 0.8652777777777777 | 0 |
| 0.8659722222222223 | 0 |
| 0.8666666666666667 | 0 |
| 0.8673611111111111 | 0 |
| 0.8680555555555555 | 0 |
| 0.86875 | 0 |
| 0.8694444444444445 | 0 |
| 0.8701388888888889 | 0 |
| 0.8708333333333332 | 0 |
| 0.8715277777777778 | 0 |
| 0.8722222222222222 | 0 |
| 0.8729166666666667 | 0 |
| 0.873611111111111 | 0 |
| 0.8743055555555556 | 0 |
| 0.875 | 0 |
| 0.8756944444444444 | 0 |
| 0.876388888888889 | 0 |
| 0.8770833333333333 | 0 |
| 0.8777777777777778 | 0 |
| 0.8784722222222222 | 0 |
| 0.8791666666666668 | 0 |
| 0.8798611111111111 | 0 |
| 0.8805555555555555 | 0 |
| 0.88125 | 0 |
| 0.8819444444444445 | 0 |
| 0.8826388888888889 | 0 |
| 0.8833333333333333 | 0 |
| 0.8840277777777777 | 0 |
| 0.8847222222222223 | 0 |
| 0.8854166666666666 | 0 |
| 0.8861111111111111 | 0 |
| 0.8868055555555556 | 0 |
| 0.8875000000000001 | 0 |
| 0.8881944444444444 | 0 |
| 0.8888888888888888 | 0 |
| 0.8895833333333334 | 0 |
| 0.8902777777777778 | 0 |
| 0.8909722222222222 | 0 |
| 0.8916666666666666 | 0 |
| 0.8923611111111112 | 0 |
| 0.8930555555555556 | 0 |
| 0.8937499999999999 | 0 |
| 0.8944444444444444 | 0 |
| 0.8951388888888889 | 0 |
| 0.8958333333333334 | 0 |
| 0.8965277777777777 | 0 |
| 0.8972222222222223 | 0 |
| 0.8979166666666667 | 0 |
| 0.8986111111111111 | 0 |
| 0.8993055555555555 | 0 |
| 0.9 | 0 |
| 0.9006944444444445 | 0 |
| 0.9013888888888889 | 0 |
| 0.9020833333333332 | 0 |
| 0.9027777777777778 | 0 |
| 0.9034722222222222 | 0 |
| 0.9041666666666667 | 0 |
| 0.904861111111111 | 0 |
| 0.9055555555555556 | 0 |
| 0.90625 | 0 |
| 0.9069444444444444 | 0 |
| 0.907638888888889 | 0 |
| 0.9083333333333333 | 0 |
| 0.9090277777777778 | 0 |
| 0.9097222222222222 | 0 |
| 0.9104166666666668 | 0 |
| 0.9111111111111111 | 0 |
| 0.9118055555555555 | 0 |
| 0.9125 | 0 |
| 0.9131944444444445 | 0 |
| 0.9138888888888889 | 0 |
| 0.9145833333333333 | 0 |
| 0.9152777777777777 | 0 |
| 0.9159722222222223 | 0 |
| 0.9166666666666666 | 0 |
| 0.9173611111111111 | 0 |
| 0.9180555555555556 | 0 |
| 0.9187500000000001 | 0 |
| 0.9194444444444444 | 0 |
| 0.9201388888888888 | 0 |
| 0.9208333333333334 | 0 |
| 0.9215277777777778 | 0 |
| 0.9222222222222222 | 0 |
| 0.9229166666666666 | 0 |
| 0.9236111111111112 | 0 |
| 0.9243055555555556 | 0 |
| 0.9249999999999999 | 0 |
| 0.9256944444444444 | 0 |
| 0.9263888888888889 | 0 |
| 0.9270833333333334 | 0 |
| 0.9277777777777777 | 0 |
| 0.9284722222222223 | 0 |
| 0.9291666666666667 | 0 |
| 0.9298611111111111 | 0 |
| 0.9305555555555555 | 0 |
| 0.93125 | 0 |
| 0.9319444444444445 | 0 |
| 0.9326388888888889 | 0 |
| 0.9333333333333332 | 0 |
| 0.9340277777777778 | 0 |
| 0.9347222222222222 | 0 |
| 0.9354166666666667 | 0 |
| 0.936111111111111 | 0 |
| 0.9368055555555556 | 0 |
| 0.9375 | 0 |
| 0.9381944444444444 | 0 |
| 0.938888888888889 | 0 |
| 0.9395833333333333 | 0 |
| 0.9402777777777778 | 0 |
| 0.9409722222222222 | 0 |
| 0.9416666666666668 | 0 |
| 0.9423611111111111 | 0 |
| 0.9430555555555555 | 0 |
| 0.94375 | 0 |
| 0.9444444444444445 | 0 |
| 0.9451388888888889 | 0 |
| 0.9458333333333333 | 0 |
| 0.9465277777777777 | 0 |
| 0.9472222222222223 | 0 |
| 0.9479166666666666 | 0 |
| 0.9486111111111111 | 0 |
| 0.9493055555555556 | 0 |
| 0.9500000000000001 | 0 |
| 0.9506944444444444 | 0 |
| 0.9513888888888888 | 0 |
| 0.9520833333333334 | 0 |
| 0.9527777777777778 | 0 |
| 0.9534722222222222 | 0 |
| 0.9541666666666666 | 0 |
| 0.9548611111111112 | 0 |
| 0.9555555555555556 | 0 |
| 0.9562499999999999 | 0 |
| 0.9569444444444444 | 0 |
| 0.9576388888888889 | 0 |
| 0.9583333333333334 | 0 |
| 0.9590277777777777 | 0 |
| 0.9597222222222223 | 0 |
| 0.9604166666666667 | 0 |
| 0.9611111111111111 | 0 |
| 0.9618055555555555 | 0 |
| 0.9625 | 0 |
| 0.9631944444444445 | 0 |
| 0.9638888888888889 | 0 |
| 0.9645833333333332 | 0 |
| 0.9652777777777778 | 0 |
| 0.9659722222222222 | 0 |
| 0.9666666666666667 | 0 |
| 0.967361111111111 | 0 |
| 0.9680555555555556 | 0 |
| 0.96875 | 0 |
| 0.9694444444444444 | 0 |
| 0.970138888888889 | 0 |
| 0.9708333333333333 | 0 |
| 0.9715277777777778 | 0 |
| 0.9722222222222222 | 0 |
| 0.9729166666666668 | 0 |
| 0.9736111111111111 | 0 |
| 0.9743055555555555 | 0 |
| 0.975 | 0 |
| 0.9756944444444445 | 0 |
| 0.9763888888888889 | 0 |
| 0.9770833333333333 | 0 |
| 0.9777777777777777 | 0 |
| 0.9784722222222223 | 0 |
| 0.9791666666666666 | 0 |
| 0.9798611111111111 | 0 |
| 0.9805555555555556 | 0 |
| 0.9812500000000001 | 0 |
| 0.9819444444444444 | 0 |
| 0.9826388888888888 | 0 |
| 0.9833333333333334 | 0 |
| 0.9840277777777778 | 0 |
| 0.9847222222222222 | 0 |
| 0.9854166666666666 | 0 |
| 0.9861111111111112 | 0 |
| 0.9868055555555556 | 0 |
| 0.9874999999999999 | 0 |
| 0.9881944444444444 | 0 |
| 0.9888888888888889 | 0 |
| 0.9895833333333334 | 0 |
| 0.9902777777777777 | 0 |
| 0.9909722222222223 | 0 |
| 0.9916666666666667 | 0 |
| 0.9923611111111111 | 0 |
| 0.9930555555555555 | 0 |
| 0.99375 | 0 |
| 0.9944444444444445 | 0 |
| 0.9951388888888889 | 0 |
| 0.9958333333333332 | 0 |
| 0.9965277777777778 | 0 |
| 0.9972222222222222 | 0 |
| 0.9979166666666667 | 0 |
| 0.998611111111111 | 0 |
| 0.9993055555555556 | 0 |